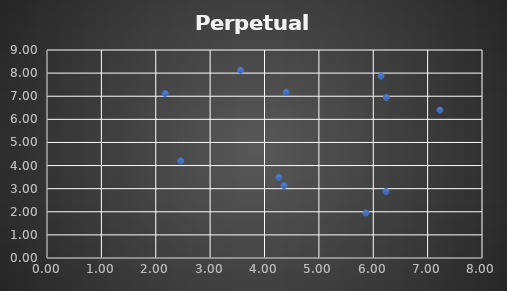
| Category | Series 0 |
|---|---|
| 6.1435958866068425 | 7.876 |
| 4.2651760716052705 | 3.489 |
| 2.460287758028664 | 4.202 |
| 4.397738545825968 | 7.173 |
| 2.173664549797352 | 7.117 |
| 3.5594770434258303 | 8.125 |
| 4.359569183980377 | 3.132 |
| 6.2348287792905595 | 2.878 |
| 7.224837040448966 | 6.398 |
| 5.863273737589276 | 1.949 |
| 6.240899537482283 | 6.943 |